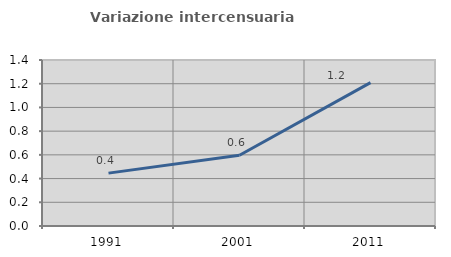
| Category | Variazione intercensuaria annua |
|---|---|
| 1991.0 | 0.446 |
| 2001.0 | 0.597 |
| 2011.0 | 1.209 |